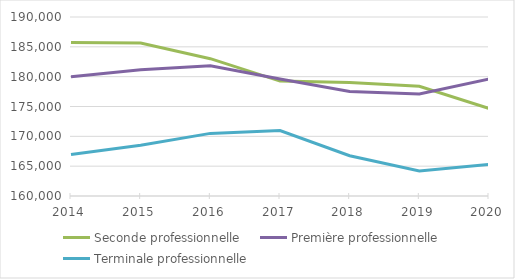
| Category | Seconde professionnelle | Première professionnelle | Terminale professionnelle |
|---|---|---|---|
| 2014.0 | 185725 | 179992 | 166965 |
| 2015.0 | 185641 | 181172 | 168520 |
| 2016.0 | 183014 | 181821 | 170495 |
| 2017.0 | 179261 | 179625 | 170981 |
| 2018.0 | 179002 | 177529 | 166749 |
| 2019.0 | 178398 | 177099 | 164195 |
| 2020.0 | 174667 | 179596 | 165285 |